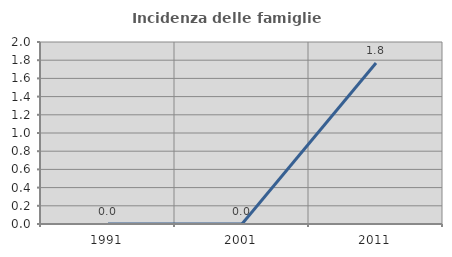
| Category | Incidenza delle famiglie numerose |
|---|---|
| 1991.0 | 0 |
| 2001.0 | 0 |
| 2011.0 | 1.77 |